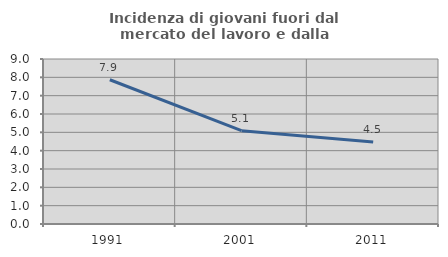
| Category | Incidenza di giovani fuori dal mercato del lavoro e dalla formazione  |
|---|---|
| 1991.0 | 7.867 |
| 2001.0 | 5.092 |
| 2011.0 | 4.474 |